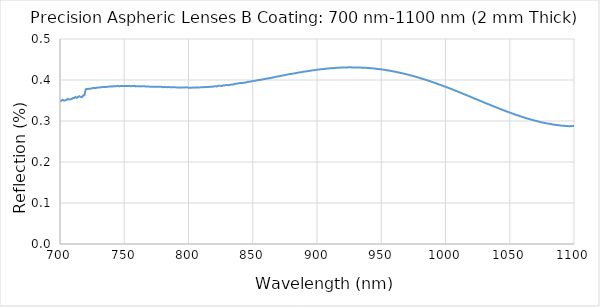
| Category | Reflection |
|---|---|
| 1100.0 | 0.288 |
| 1099.0 | 0.288 |
| 1098.0 | 0.287 |
| 1097.0 | 0.288 |
| 1096.0 | 0.287 |
| 1095.0 | 0.288 |
| 1094.0 | 0.288 |
| 1093.0 | 0.288 |
| 1092.0 | 0.288 |
| 1091.0 | 0.289 |
| 1090.0 | 0.289 |
| 1089.0 | 0.289 |
| 1088.0 | 0.29 |
| 1087.0 | 0.29 |
| 1086.0 | 0.29 |
| 1085.0 | 0.291 |
| 1084.0 | 0.291 |
| 1083.0 | 0.292 |
| 1082.0 | 0.292 |
| 1081.0 | 0.293 |
| 1080.0 | 0.293 |
| 1079.0 | 0.294 |
| 1078.0 | 0.295 |
| 1077.0 | 0.295 |
| 1076.0 | 0.296 |
| 1075.0 | 0.297 |
| 1074.0 | 0.297 |
| 1073.0 | 0.298 |
| 1072.0 | 0.299 |
| 1071.0 | 0.3 |
| 1070.0 | 0.301 |
| 1069.0 | 0.301 |
| 1068.0 | 0.302 |
| 1067.0 | 0.303 |
| 1066.0 | 0.304 |
| 1065.0 | 0.305 |
| 1064.0 | 0.306 |
| 1063.0 | 0.307 |
| 1062.0 | 0.308 |
| 1061.0 | 0.309 |
| 1060.0 | 0.31 |
| 1059.0 | 0.311 |
| 1058.0 | 0.312 |
| 1057.0 | 0.313 |
| 1056.0 | 0.314 |
| 1055.0 | 0.315 |
| 1054.0 | 0.316 |
| 1053.0 | 0.317 |
| 1052.0 | 0.318 |
| 1051.0 | 0.319 |
| 1050.0 | 0.32 |
| 1049.0 | 0.322 |
| 1048.0 | 0.323 |
| 1047.0 | 0.324 |
| 1046.0 | 0.325 |
| 1045.0 | 0.326 |
| 1044.0 | 0.328 |
| 1043.0 | 0.329 |
| 1042.0 | 0.33 |
| 1041.0 | 0.331 |
| 1040.0 | 0.333 |
| 1039.0 | 0.334 |
| 1038.0 | 0.335 |
| 1037.0 | 0.336 |
| 1036.0 | 0.338 |
| 1035.0 | 0.339 |
| 1034.0 | 0.34 |
| 1033.0 | 0.341 |
| 1032.0 | 0.343 |
| 1031.0 | 0.344 |
| 1030.0 | 0.345 |
| 1029.0 | 0.347 |
| 1028.0 | 0.348 |
| 1027.0 | 0.349 |
| 1026.0 | 0.35 |
| 1025.0 | 0.352 |
| 1024.0 | 0.353 |
| 1023.0 | 0.354 |
| 1022.0 | 0.356 |
| 1021.0 | 0.357 |
| 1020.0 | 0.358 |
| 1019.0 | 0.36 |
| 1018.0 | 0.361 |
| 1017.0 | 0.362 |
| 1016.0 | 0.363 |
| 1015.0 | 0.365 |
| 1014.0 | 0.366 |
| 1013.0 | 0.367 |
| 1012.0 | 0.369 |
| 1011.0 | 0.37 |
| 1010.0 | 0.371 |
| 1009.0 | 0.372 |
| 1008.0 | 0.374 |
| 1007.0 | 0.375 |
| 1006.0 | 0.376 |
| 1005.0 | 0.377 |
| 1004.0 | 0.379 |
| 1003.0 | 0.38 |
| 1002.0 | 0.381 |
| 1001.0 | 0.382 |
| 1000.0 | 0.383 |
| 999.0 | 0.385 |
| 998.0 | 0.386 |
| 997.0 | 0.387 |
| 996.0 | 0.388 |
| 995.0 | 0.389 |
| 994.0 | 0.39 |
| 993.0 | 0.391 |
| 992.0 | 0.393 |
| 991.0 | 0.394 |
| 990.0 | 0.395 |
| 989.0 | 0.396 |
| 988.0 | 0.397 |
| 987.0 | 0.398 |
| 986.0 | 0.399 |
| 985.0 | 0.4 |
| 984.0 | 0.401 |
| 983.0 | 0.402 |
| 982.0 | 0.403 |
| 981.0 | 0.404 |
| 980.0 | 0.405 |
| 979.0 | 0.406 |
| 978.0 | 0.407 |
| 977.0 | 0.408 |
| 976.0 | 0.409 |
| 975.0 | 0.41 |
| 974.0 | 0.41 |
| 973.0 | 0.411 |
| 972.0 | 0.412 |
| 971.0 | 0.413 |
| 970.0 | 0.414 |
| 969.0 | 0.414 |
| 968.0 | 0.415 |
| 967.0 | 0.416 |
| 966.0 | 0.417 |
| 965.0 | 0.417 |
| 964.0 | 0.418 |
| 963.0 | 0.419 |
| 962.0 | 0.419 |
| 961.0 | 0.42 |
| 960.0 | 0.421 |
| 959.0 | 0.421 |
| 958.0 | 0.422 |
| 957.0 | 0.422 |
| 956.0 | 0.423 |
| 955.0 | 0.423 |
| 954.0 | 0.424 |
| 953.0 | 0.425 |
| 952.0 | 0.425 |
| 951.0 | 0.425 |
| 950.0 | 0.426 |
| 949.0 | 0.426 |
| 948.0 | 0.427 |
| 947.0 | 0.427 |
| 946.0 | 0.427 |
| 945.0 | 0.428 |
| 944.0 | 0.428 |
| 943.0 | 0.428 |
| 942.0 | 0.429 |
| 941.0 | 0.429 |
| 940.0 | 0.429 |
| 939.0 | 0.429 |
| 938.0 | 0.43 |
| 937.0 | 0.43 |
| 936.0 | 0.43 |
| 935.0 | 0.43 |
| 934.0 | 0.43 |
| 933.0 | 0.43 |
| 932.0 | 0.431 |
| 931.0 | 0.431 |
| 930.0 | 0.431 |
| 929.0 | 0.431 |
| 928.0 | 0.431 |
| 927.0 | 0.431 |
| 926.0 | 0.431 |
| 925.0 | 0.431 |
| 924.0 | 0.431 |
| 923.0 | 0.431 |
| 922.0 | 0.431 |
| 921.0 | 0.431 |
| 920.0 | 0.431 |
| 919.0 | 0.43 |
| 918.0 | 0.43 |
| 917.0 | 0.43 |
| 916.0 | 0.43 |
| 915.0 | 0.43 |
| 914.0 | 0.429 |
| 913.0 | 0.429 |
| 912.0 | 0.429 |
| 911.0 | 0.429 |
| 910.0 | 0.428 |
| 909.0 | 0.428 |
| 908.0 | 0.428 |
| 907.0 | 0.428 |
| 906.0 | 0.427 |
| 905.0 | 0.427 |
| 904.0 | 0.426 |
| 903.0 | 0.426 |
| 902.0 | 0.426 |
| 901.0 | 0.425 |
| 900.0 | 0.425 |
| 899.0 | 0.425 |
| 898.0 | 0.424 |
| 897.0 | 0.424 |
| 896.0 | 0.423 |
| 895.0 | 0.423 |
| 894.0 | 0.422 |
| 893.0 | 0.422 |
| 892.0 | 0.421 |
| 891.0 | 0.421 |
| 890.0 | 0.42 |
| 889.0 | 0.42 |
| 888.0 | 0.419 |
| 887.0 | 0.419 |
| 886.0 | 0.418 |
| 885.0 | 0.418 |
| 884.0 | 0.417 |
| 883.0 | 0.417 |
| 882.0 | 0.416 |
| 881.0 | 0.415 |
| 880.0 | 0.415 |
| 879.0 | 0.415 |
| 878.0 | 0.414 |
| 877.0 | 0.413 |
| 876.0 | 0.413 |
| 875.0 | 0.412 |
| 874.0 | 0.411 |
| 873.0 | 0.411 |
| 872.0 | 0.41 |
| 871.0 | 0.409 |
| 870.0 | 0.409 |
| 869.0 | 0.408 |
| 868.0 | 0.408 |
| 867.0 | 0.407 |
| 866.0 | 0.406 |
| 865.0 | 0.406 |
| 864.0 | 0.405 |
| 863.0 | 0.405 |
| 862.0 | 0.404 |
| 861.0 | 0.404 |
| 860.0 | 0.403 |
| 859.0 | 0.402 |
| 858.0 | 0.402 |
| 857.0 | 0.401 |
| 856.0 | 0.4 |
| 855.0 | 0.4 |
| 854.0 | 0.4 |
| 853.0 | 0.399 |
| 852.0 | 0.398 |
| 851.0 | 0.398 |
| 850.0 | 0.397 |
| 849.0 | 0.397 |
| 848.0 | 0.396 |
| 847.0 | 0.396 |
| 846.0 | 0.395 |
| 845.0 | 0.394 |
| 844.0 | 0.394 |
| 843.0 | 0.394 |
| 842.0 | 0.393 |
| 841.0 | 0.393 |
| 840.0 | 0.393 |
| 839.0 | 0.392 |
| 838.0 | 0.391 |
| 837.0 | 0.391 |
| 836.0 | 0.391 |
| 835.0 | 0.389 |
| 834.0 | 0.389 |
| 833.0 | 0.389 |
| 832.0 | 0.388 |
| 831.0 | 0.387 |
| 830.0 | 0.388 |
| 829.0 | 0.388 |
| 828.0 | 0.387 |
| 827.0 | 0.387 |
| 826.0 | 0.385 |
| 825.0 | 0.386 |
| 824.0 | 0.386 |
| 823.0 | 0.386 |
| 822.0 | 0.384 |
| 821.0 | 0.385 |
| 820.0 | 0.384 |
| 819.0 | 0.384 |
| 818.0 | 0.383 |
| 817.0 | 0.384 |
| 816.0 | 0.383 |
| 815.0 | 0.383 |
| 814.0 | 0.383 |
| 813.0 | 0.383 |
| 812.0 | 0.383 |
| 811.0 | 0.382 |
| 810.0 | 0.382 |
| 809.0 | 0.382 |
| 808.0 | 0.382 |
| 807.0 | 0.382 |
| 806.0 | 0.381 |
| 805.0 | 0.382 |
| 804.0 | 0.381 |
| 803.0 | 0.381 |
| 802.0 | 0.381 |
| 801.0 | 0.381 |
| 800.0 | 0.381 |
| 799.0 | 0.382 |
| 798.0 | 0.382 |
| 797.0 | 0.381 |
| 796.0 | 0.382 |
| 795.0 | 0.381 |
| 794.0 | 0.381 |
| 793.0 | 0.381 |
| 792.0 | 0.382 |
| 791.0 | 0.382 |
| 790.0 | 0.382 |
| 789.0 | 0.382 |
| 788.0 | 0.383 |
| 787.0 | 0.382 |
| 786.0 | 0.382 |
| 785.0 | 0.383 |
| 784.0 | 0.383 |
| 783.0 | 0.382 |
| 782.0 | 0.383 |
| 781.0 | 0.383 |
| 780.0 | 0.383 |
| 779.0 | 0.383 |
| 778.0 | 0.384 |
| 777.0 | 0.383 |
| 776.0 | 0.384 |
| 775.0 | 0.383 |
| 774.0 | 0.383 |
| 773.0 | 0.384 |
| 772.0 | 0.384 |
| 771.0 | 0.384 |
| 770.0 | 0.384 |
| 769.0 | 0.384 |
| 768.0 | 0.384 |
| 767.0 | 0.384 |
| 766.0 | 0.385 |
| 765.0 | 0.384 |
| 764.0 | 0.385 |
| 763.0 | 0.384 |
| 762.0 | 0.385 |
| 761.0 | 0.385 |
| 760.0 | 0.385 |
| 759.0 | 0.384 |
| 758.0 | 0.385 |
| 757.0 | 0.385 |
| 756.0 | 0.385 |
| 755.0 | 0.385 |
| 754.0 | 0.386 |
| 753.0 | 0.385 |
| 752.0 | 0.385 |
| 751.0 | 0.385 |
| 750.0 | 0.385 |
| 749.0 | 0.385 |
| 748.0 | 0.386 |
| 747.0 | 0.385 |
| 746.0 | 0.385 |
| 745.0 | 0.386 |
| 744.0 | 0.385 |
| 743.0 | 0.385 |
| 742.0 | 0.385 |
| 741.0 | 0.384 |
| 740.0 | 0.384 |
| 739.0 | 0.384 |
| 738.0 | 0.384 |
| 737.0 | 0.384 |
| 736.0 | 0.383 |
| 735.0 | 0.383 |
| 734.0 | 0.383 |
| 733.0 | 0.383 |
| 732.0 | 0.382 |
| 731.0 | 0.382 |
| 730.0 | 0.382 |
| 729.0 | 0.381 |
| 728.0 | 0.381 |
| 727.0 | 0.38 |
| 726.0 | 0.38 |
| 725.0 | 0.38 |
| 724.0 | 0.379 |
| 723.0 | 0.379 |
| 722.0 | 0.378 |
| 721.0 | 0.378 |
| 720.0 | 0.377 |
| 719.0 | 0.363 |
| 718.0 | 0.362 |
| 717.0 | 0.358 |
| 716.0 | 0.359 |
| 715.0 | 0.361 |
| 714.0 | 0.359 |
| 713.0 | 0.357 |
| 712.0 | 0.359 |
| 711.0 | 0.356 |
| 710.0 | 0.356 |
| 709.0 | 0.353 |
| 708.0 | 0.353 |
| 707.0 | 0.352 |
| 706.0 | 0.354 |
| 705.0 | 0.352 |
| 704.0 | 0.35 |
| 703.0 | 0.35 |
| 702.0 | 0.352 |
| 701.0 | 0.349 |
| 700.0 | 0.348 |